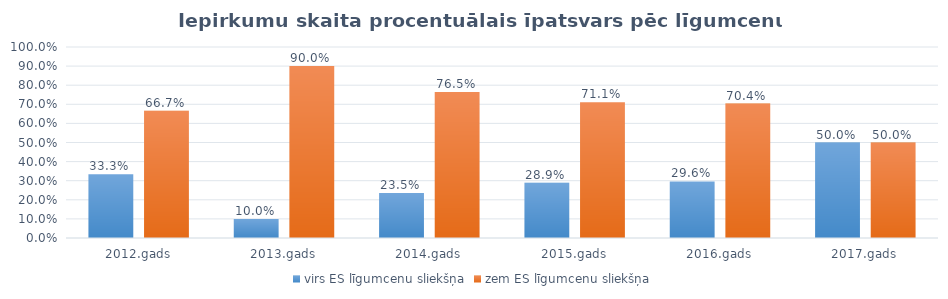
| Category | virs ES līgumcenu sliekšņa | zem ES līgumcenu sliekšņa |
|---|---|---|
| 2012.gads | 0.333 | 0.667 |
| 2013.gads | 0.1 | 0.9 |
| 2014.gads | 0.235 | 0.765 |
| 2015.gads | 0.289 | 0.711 |
| 2016.gads | 0.296 | 0.704 |
| 2017.gads | 0.5 | 0.5 |